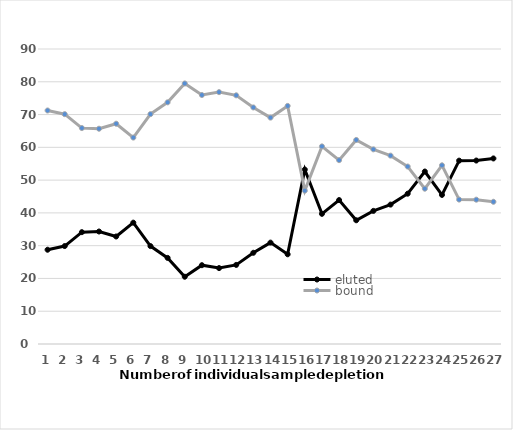
| Category | eluted  | bound |
|---|---|---|
| 0 | 28.76 | 71.24 |
| 1 | 29.88 | 70.12 |
| 2 | 34.12 | 65.88 |
| 3 | 34.32 | 65.68 |
| 4 | 32.8 | 67.2 |
| 5 | 37.02 | 62.98 |
| 6 | 29.87 | 70.13 |
| 7 | 26.27 | 73.73 |
| 8 | 20.52 | 79.48 |
| 9 | 24.04 | 75.96 |
| 10 | 23.16 | 76.84 |
| 11 | 24.13 | 75.87 |
| 12 | 27.83 | 72.17 |
| 13 | 30.93 | 69.07 |
| 14 | 27.37 | 72.63 |
| 15 | 53.22 | 46.78 |
| 16 | 39.71 | 60.29 |
| 17 | 43.91 | 56.09 |
| 18 | 37.75 | 62.25 |
| 19 | 40.61 | 59.39 |
| 20 | 42.53 | 57.47 |
| 21 | 45.86 | 54.14 |
| 22 | 52.62 | 47.38 |
| 23 | 45.49 | 54.51 |
| 24 | 55.94 | 44.06 |
| 25 | 55.97 | 44.03 |
| 26 | 56.61 | 43.39 |